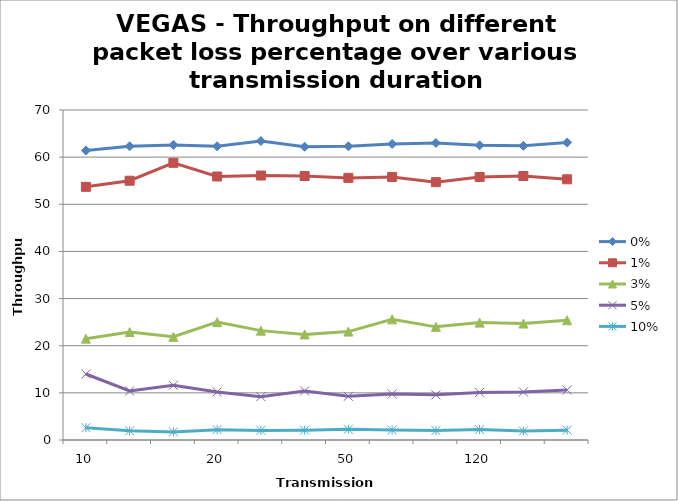
| Category | 0% | 1% | 3% | 5% | 10% |
|---|---|---|---|---|---|
| 10.0 | 61.4 | 53.7 | 21.5 | 14 | 2.61 |
| nan | 62.3 | 55 | 22.9 | 10.4 | 1.96 |
| nan | 62.6 | 58.8 | 21.9 | 11.6 | 1.71 |
| 20.0 | 62.3 | 55.9 | 25 | 10.2 | 2.2 |
| nan | 63.4 | 56.1 | 23.2 | 9.2 | 2.03 |
| nan | 62.2 | 56 | 22.4 | 10.4 | 2.07 |
| 50.0 | 62.3 | 55.6 | 23 | 9.27 | 2.29 |
| nan | 62.8 | 55.8 | 25.6 | 9.76 | 2.12 |
| nan | 63 | 54.7 | 24 | 9.58 | 2 |
| 120.0 | 62.5 | 55.8 | 24.9 | 10.1 | 2.21 |
| nan | 62.4 | 56 | 24.7 | 10.2 | 1.91 |
| nan | 63.1 | 55.3 | 25.4 | 10.6 | 2.09 |